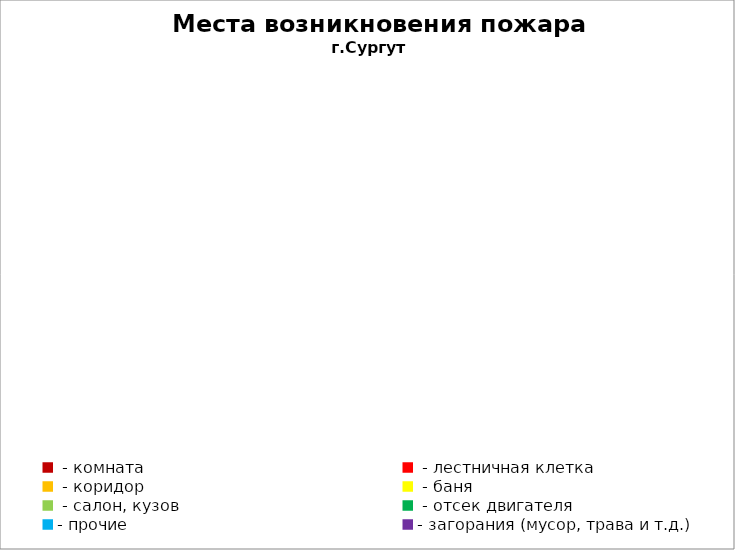
| Category | Места возникновения пожара |
|---|---|
|  - комната | 20 |
|  - лестничная клетка | 1 |
|  - коридор | 1 |
|  - баня | 2 |
|  - салон, кузов | 5 |
|  - отсек двигателя | 6 |
| - прочие | 16 |
| - загорания (мусор, трава и т.д.)  | 11 |